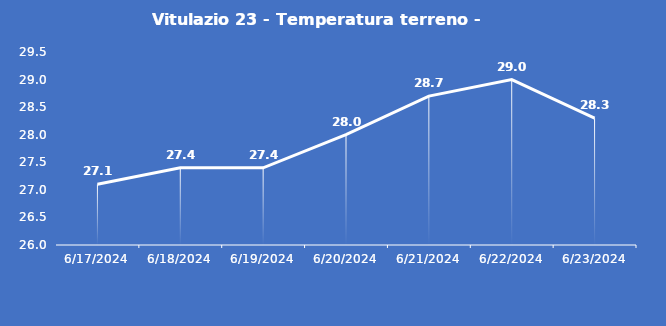
| Category | Vitulazio 23 - Temperatura terreno - Grezzo (°C) |
|---|---|
| 6/17/24 | 27.1 |
| 6/18/24 | 27.4 |
| 6/19/24 | 27.4 |
| 6/20/24 | 28 |
| 6/21/24 | 28.7 |
| 6/22/24 | 29 |
| 6/23/24 | 28.3 |